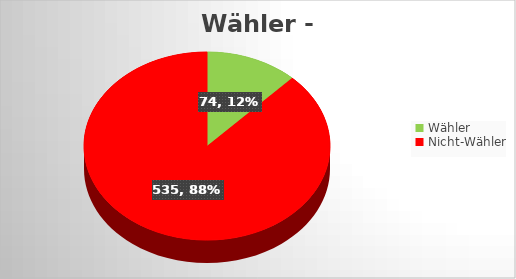
| Category | Series 0 |
|---|---|
| Wähler | 74 |
| Nicht-Wähler | 535 |